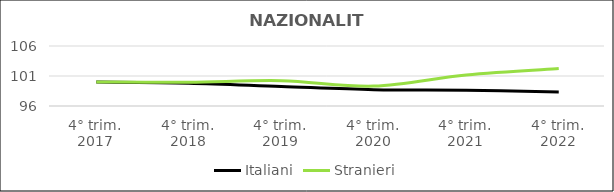
| Category | Italiani | Stranieri |
|---|---|---|
| 4° trim.
2017 | 100 | 100 |
| 4° trim.
2018 | 99.81 | 99.957 |
| 4° trim.
2019 | 99.255 | 100.214 |
| 4° trim.
2020 | 98.718 | 99.315 |
| 4° trim.
2021 | 98.623 | 101.185 |
| 4° trim.
2022 | 98.33 | 102.242 |